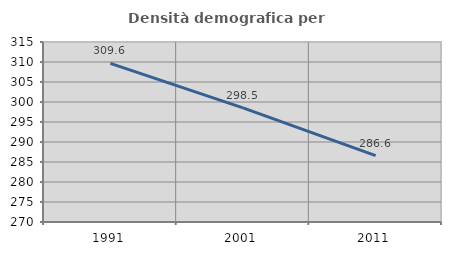
| Category | Densità demografica |
|---|---|
| 1991.0 | 309.64 |
| 2001.0 | 298.536 |
| 2011.0 | 286.592 |